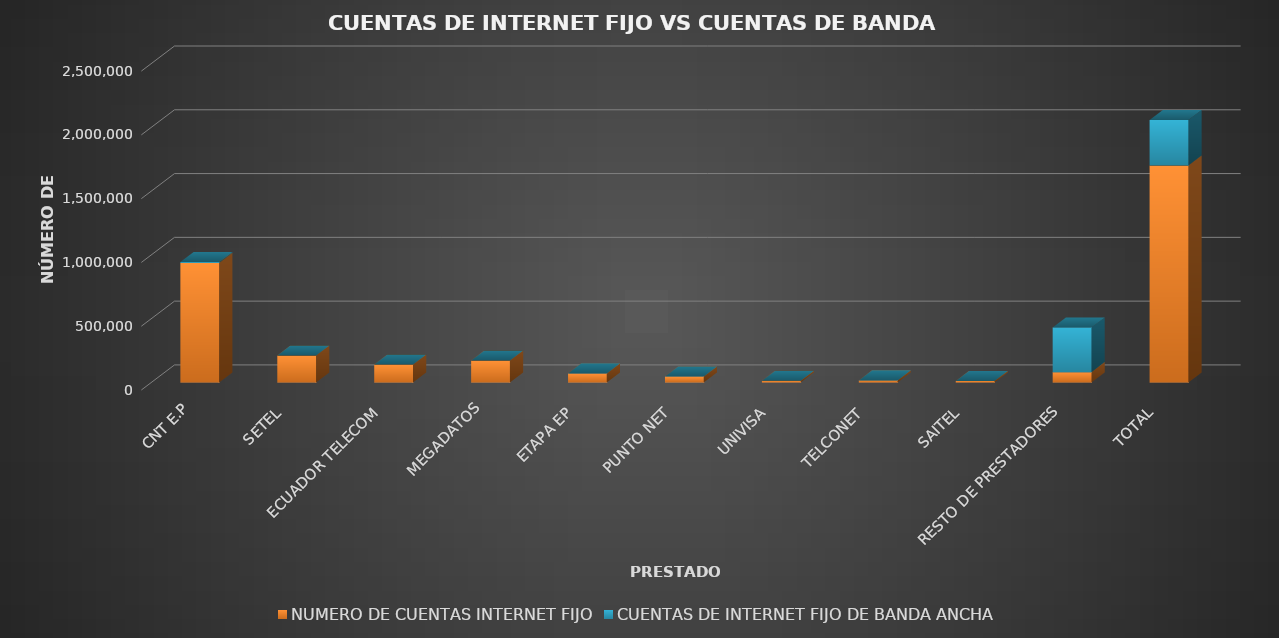
| Category | NUMERO DE CUENTAS INTERNET FIJO | CUENTAS DE INTERNET FIJO DE BANDA ANCHA |
|---|---|---|
| CNT E.P | 937219 | 6726 |
| SETEL | 210742 | 0 |
| ECUADOR TELECOM | 140540 | 1 |
| MEGADATOS | 171456 | 0 |
| ETAPA EP | 71179 | 0 |
| PUNTO NET | 46890 | 15 |
| UNIVISA | 12601 | 0 |
| TELCONET | 16245 | 0 |
| SAITEL | 12117 | 33 |
| RESTO DE PRESTADORES | 81118 | 350215 |
| TOTAL | 1700107 | 356990 |